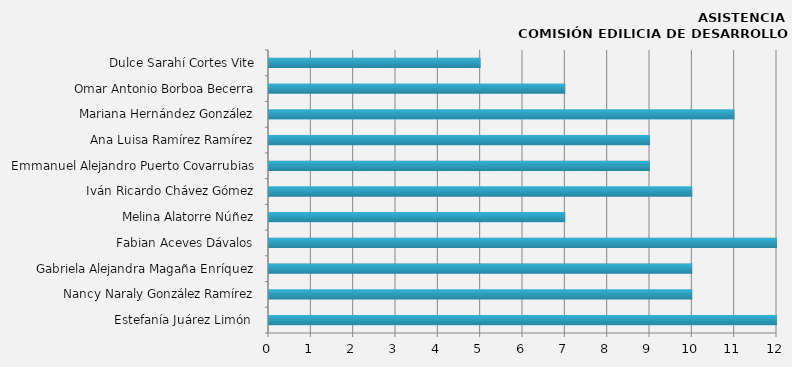
| Category | Estefanía Juárez Limón  |
|---|---|
| Estefanía Juárez Limón  | 12 |
| Nancy Naraly González Ramírez | 10 |
| Gabriela Alejandra Magaña Enríquez | 10 |
| Fabian Aceves Dávalos | 12 |
| Melina Alatorre Núñez | 7 |
| Iván Ricardo Chávez Gómez | 10 |
| Emmanuel Alejandro Puerto Covarrubias | 9 |
| Ana Luisa Ramírez Ramírez | 9 |
| Mariana Hernández González | 11 |
| Omar Antonio Borboa Becerra | 7 |
| Dulce Sarahí Cortes Vite | 5 |